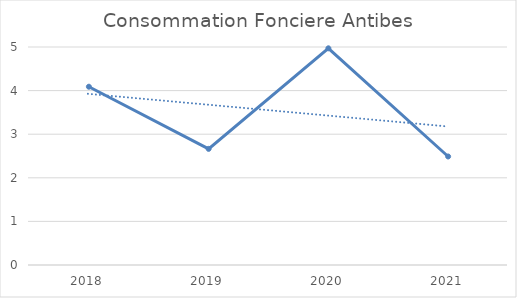
| Category | Series 0 |
|---|---|
| 2018.0 | 4.089 |
| 2019.0 | 2.664 |
| 2020.0 | 4.97 |
| 2021.0 | 2.489 |